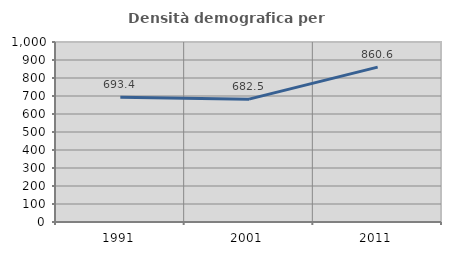
| Category | Densità demografica |
|---|---|
| 1991.0 | 693.408 |
| 2001.0 | 682.475 |
| 2011.0 | 860.626 |